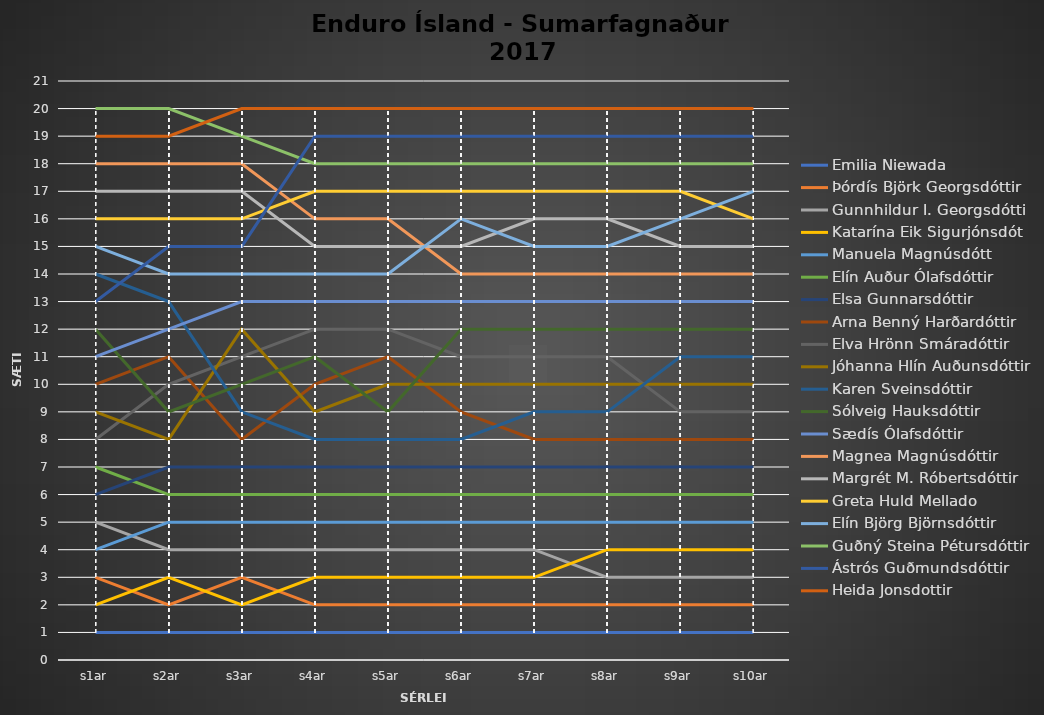
| Category | Emilia Niewada | Þórdís Björk Georgsdóttir | Gunnhildur I. Georgsdótti | Katarína Eik Sigurjónsdót | Manuela Magnúsdótt | Elín Auður Ólafsdóttir | Elsa Gunnarsdóttir | Arna Benný Harðardóttir | Elva Hrönn Smáradóttir | Jóhanna Hlín Auðunsdóttir | Karen Sveinsdóttir | Sólveig Hauksdóttir | Sædís Ólafsdóttir | Magnea Magnúsdóttir | Margrét M. Róbertsdóttir | Greta Huld Mellado | Elín Björg Björnsdóttir | Guðný Steina Pétursdóttir | Ástrós Guðmundsdóttir | Heida Jonsdottir |
|---|---|---|---|---|---|---|---|---|---|---|---|---|---|---|---|---|---|---|---|---|
| s1ar | 1 | 3 | 5 | 2 | 4 | 7 | 6 | 10 | 8 | 9 | 14 | 12 | 11 | 18 | 17 | 16 | 15 | 20 | 13 | 19 |
| s2ar | 1 | 2 | 4 | 3 | 5 | 6 | 7 | 11 | 10 | 8 | 13 | 9 | 12 | 18 | 17 | 16 | 14 | 20 | 15 | 19 |
| s3ar | 1 | 3 | 4 | 2 | 5 | 6 | 7 | 8 | 11 | 12 | 9 | 10 | 13 | 18 | 17 | 16 | 14 | 19 | 15 | 20 |
| s4ar | 1 | 2 | 4 | 3 | 5 | 6 | 7 | 10 | 12 | 9 | 8 | 11 | 13 | 16 | 15 | 17 | 14 | 18 | 19 | 20 |
| s5ar | 1 | 2 | 4 | 3 | 5 | 6 | 7 | 11 | 12 | 10 | 8 | 9 | 13 | 16 | 15 | 17 | 14 | 18 | 19 | 20 |
| s6ar | 1 | 2 | 4 | 3 | 5 | 6 | 7 | 9 | 11 | 10 | 8 | 12 | 13 | 14 | 15 | 17 | 16 | 18 | 19 | 20 |
| s7ar | 1 | 2 | 4 | 3 | 5 | 6 | 7 | 8 | 11 | 10 | 9 | 12 | 13 | 14 | 16 | 17 | 15 | 18 | 19 | 20 |
| s8ar | 1 | 2 | 3 | 4 | 5 | 6 | 7 | 8 | 11 | 10 | 9 | 12 | 13 | 14 | 16 | 17 | 15 | 18 | 19 | 20 |
| s9ar | 1 | 2 | 3 | 4 | 5 | 6 | 7 | 8 | 9 | 10 | 11 | 12 | 13 | 14 | 15 | 17 | 16 | 18 | 19 | 20 |
| s10ar | 1 | 2 | 3 | 4 | 5 | 6 | 7 | 8 | 9 | 10 | 11 | 12 | 13 | 14 | 15 | 16 | 17 | 18 | 19 | 20 |